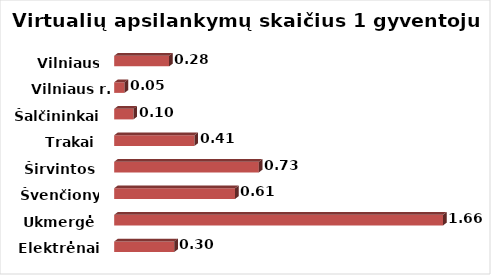
| Category | Series 0 |
|---|---|
| Elektrėnai | 0.304 |
| Ukmergė | 1.665 |
| Švenčionys | 0.612 |
| Širvintos | 0.732 |
| Trakai | 0.406 |
| Šalčininkai | 0.097 |
| Vilniaus r. | 0.052 |
| Vilniaus m. | 0.278 |